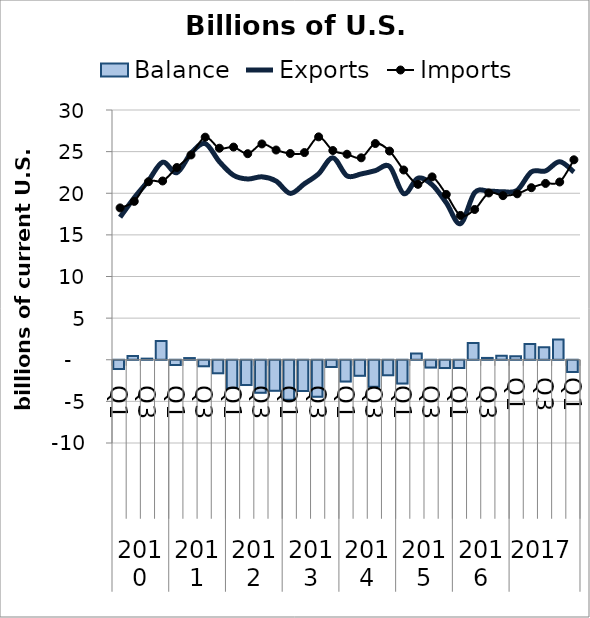
| Category | Balance |
|---|---|
| 0 | -1.115 |
| 1 | 0.439 |
| 2 | 0.135 |
| 3 | 2.253 |
| 4 | -0.622 |
| 5 | 0.204 |
| 6 | -0.77 |
| 7 | -1.613 |
| 8 | -3.388 |
| 9 | -3.039 |
| 10 | -3.95 |
| 11 | -3.725 |
| 12 | -4.792 |
| 13 | -3.745 |
| 14 | -4.437 |
| 15 | -0.874 |
| 16 | -2.604 |
| 17 | -1.935 |
| 18 | -3.256 |
| 19 | -1.848 |
| 20 | -2.848 |
| 21 | 0.738 |
| 22 | -0.939 |
| 23 | -1.006 |
| 24 | -0.987 |
| 25 | 2.019 |
| 26 | 0.22 |
| 27 | 0.468 |
| 28 | 0.42 |
| 29 | 1.894 |
| 30 | 1.503 |
| 31 | 2.438 |
| 32 | -1.473 |